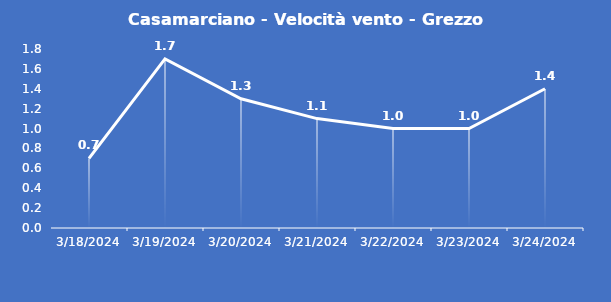
| Category | Casamarciano - Velocità vento - Grezzo (m/s) |
|---|---|
| 3/18/24 | 0.7 |
| 3/19/24 | 1.7 |
| 3/20/24 | 1.3 |
| 3/21/24 | 1.1 |
| 3/22/24 | 1 |
| 3/23/24 | 1 |
| 3/24/24 | 1.4 |